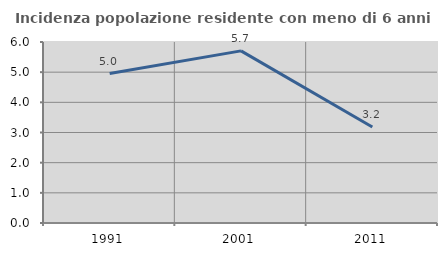
| Category | Incidenza popolazione residente con meno di 6 anni |
|---|---|
| 1991.0 | 4.955 |
| 2001.0 | 5.705 |
| 2011.0 | 3.185 |